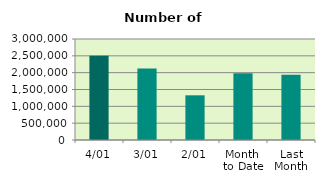
| Category | Series 0 |
|---|---|
| 4/01 | 2499104 |
| 3/01 | 2123094 |
| 2/01 | 1327468 |
| Month 
to Date | 1983222 |
| Last
Month | 1934937.048 |